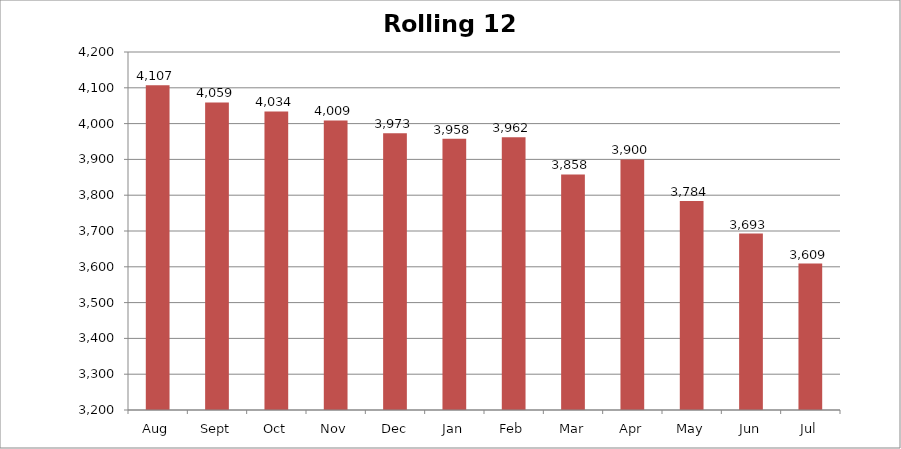
| Category | Rolling 12 Month |
|---|---|
| Aug | 4107 |
| Sept | 4059 |
| Oct | 4034 |
| Nov | 4009 |
| Dec | 3973 |
| Jan | 3958 |
| Feb | 3962 |
| Mar | 3858 |
| Apr | 3900 |
| May | 3784 |
| Jun | 3693 |
| Jul | 3609 |